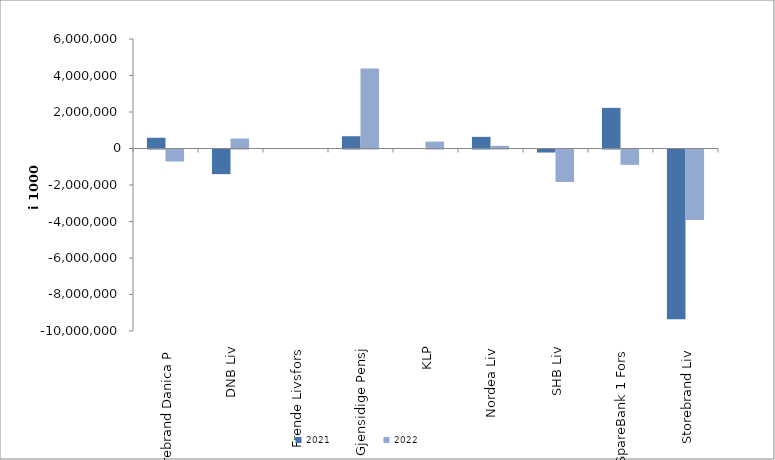
| Category | 2021 | 2022 |
|---|---|---|
| Storebrand Danica P | 587775.538 | -657818.064 |
| DNB Liv | -1350455 | 543730.59 |
| Frende Livsfors | 0 | 0 |
| Gjensidige Pensj | 671451 | 4386610 |
| KLP | 0 | 376337.441 |
| Nordea Liv | 638296 | 146328.869 |
| SHB Liv | -166180.456 | -1779753.458 |
| SpareBank 1 Fors | 2226185.166 | -840940 |
| Storebrand Liv | -9298668.836 | -3868648.264 |